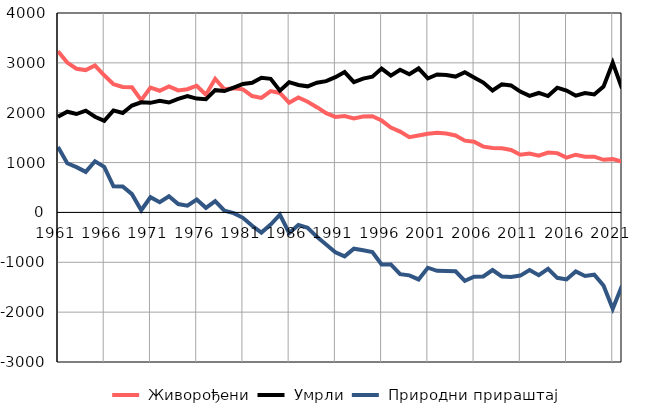
| Category |  Живорођени |  Умрли |  Природни прираштај |
|---|---|---|---|
| 1961.0 | 3234 | 1919 | 1315 |
| 1962.0 | 3006 | 2020 | 986 |
| 1963.0 | 2882 | 1974 | 908 |
| 1964.0 | 2855 | 2042 | 813 |
| 1965.0 | 2946 | 1919 | 1027 |
| 1966.0 | 2751 | 1836 | 915 |
| 1967.0 | 2571 | 2046 | 525 |
| 1968.0 | 2517 | 1995 | 522 |
| 1969.0 | 2511 | 2144 | 367 |
| 1970.0 | 2253 | 2208 | 45 |
| 1971.0 | 2503 | 2198 | 305 |
| 1972.0 | 2441 | 2237 | 204 |
| 1973.0 | 2529 | 2205 | 324 |
| 1974.0 | 2447 | 2278 | 169 |
| 1975.0 | 2472 | 2335 | 137 |
| 1976.0 | 2541 | 2284 | 257 |
| 1977.0 | 2361 | 2269 | 92 |
| 1978.0 | 2679 | 2452 | 227 |
| 1979.0 | 2471 | 2435 | 36 |
| 1980.0 | 2490 | 2505 | -15 |
| 1981.0 | 2469 | 2577 | -108 |
| 1982.0 | 2334 | 2602 | -268 |
| 1983.0 | 2296 | 2701 | -405 |
| 1984.0 | 2435 | 2679 | -244 |
| 1985.0 | 2397 | 2443 | -46 |
| 1986.0 | 2200 | 2613 | -413 |
| 1987.0 | 2307 | 2557 | -250 |
| 1988.0 | 2221 | 2529 | -308 |
| 1989.0 | 2111 | 2601 | -490 |
| 1990.0 | 1991 | 2633 | -642 |
| 1991.0 | 1915 | 2713 | -798 |
| 1992.0 | 1934 | 2815 | -881 |
| 1993.0 | 1886 | 2613 | -727 |
| 1994.0 | 1925 | 2684 | -759 |
| 1995.0 | 1928 | 2723 | -795 |
| 1996.0 | 1843 | 2885 | -1042 |
| 1997.0 | 1701 | 2743 | -1042 |
| 1998.0 | 1622 | 2861 | -1239 |
| 1999.0 | 1510 | 2772 | -1262 |
| 2000.0 | 1544 | 2888 | -1344 |
| 2001.0 | 1578 | 2687 | -1109 |
| 2002.0 | 1597 | 2768 | -1171 |
| 2003.0 | 1581 | 2757 | -1176 |
| 2004.0 | 1544 | 2725 | -1181 |
| 2005.0 | 1440 | 2812 | -1372 |
| 2006.0 | 1419 | 2708 | -1289 |
| 2007.0 | 1320 | 2605 | -1285 |
| 2008.0 | 1292 | 2447 | -1155 |
| 2009.0 | 1285 | 2570 | -1285 |
| 2010.0 | 1254 | 2548 | -1294 |
| 2011.0 | 1156 | 2423 | -1267 |
| 2012.0 | 1182 | 2338 | -1156 |
| 2013.0 | 1137 | 2396 | -1259 |
| 2014.0 | 1201 | 2334 | -1133 |
| 2015.0 | 1190 | 2502 | -1312 |
| 2016.0 | 1099 | 2444 | -1345 |
| 2017.0 | 1158 | 2341 | -1183 |
| 2018.0 | 1119 | 2394 | -1275 |
| 2019.0 | 1119 | 2367 | -1248 |
| 2020.0 | 1056 | 2523 | -1467 |
| 2021.0 | 1069 | 3002 | -1933 |
| 2022.0 | 1020 | 2490 | -1470 |